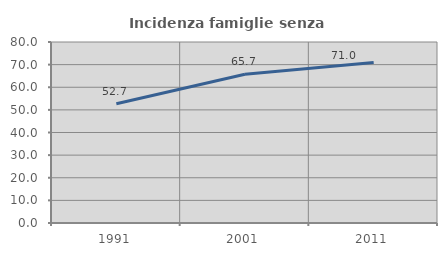
| Category | Incidenza famiglie senza nuclei |
|---|---|
| 1991.0 | 52.727 |
| 2001.0 | 65.714 |
| 2011.0 | 70.968 |